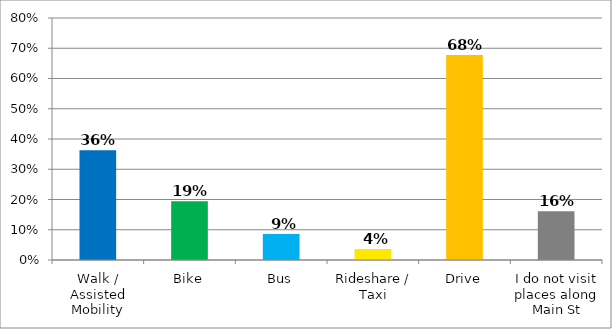
| Category | Responses |
|---|---|
| Walk / Assisted Mobility | 0.363 |
| Bike | 0.194 |
| Bus | 0.086 |
| Rideshare / Taxi | 0.036 |
| Drive | 0.678 |
| I do not visit places along Main St | 0.161 |